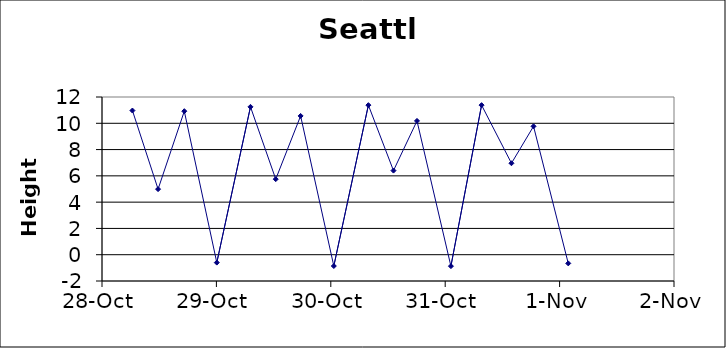
| Category | Height |
|---|---|
| 38288.26597222222 | 10.97 |
| 38288.490277777775 | 4.99 |
| 38288.71944444445 | 10.92 |
| 38289.00347222222 | -0.6 |
| 38289.29791666667 | 11.25 |
| 38289.51875 | 5.75 |
| 38289.73611111111 | 10.56 |
| 38290.02638888889 | -0.86 |
| 38290.32847222222 | 11.38 |
| 38290.54791666667 | 6.4 |
| 38290.75347222222 | 10.18 |
| 38291.05 | -0.87 |
| 38291.31805555556 | 11.38 |
| 38291.57916666667 | 6.96 |
| 38291.77222222222 | 9.77 |
| 38292.075694444444 | -0.66 |